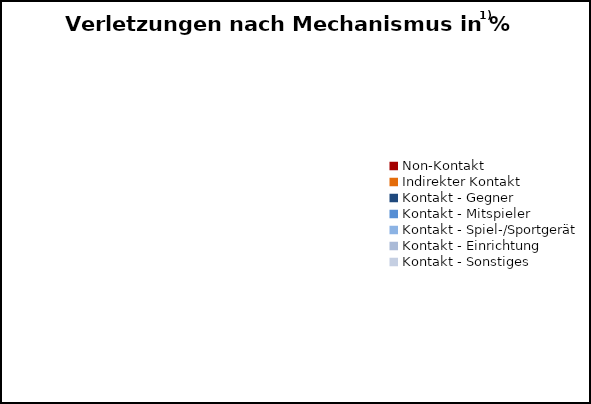
| Category | Series 0 |
|---|---|
| Non-Kontakt | 0 |
| Indirekter Kontakt | 0 |
| Kontakt - Gegner | 0 |
| Kontakt - Mitspieler | 0 |
| Kontakt - Spiel-/Sportgerät | 0 |
| Kontakt - Einrichtung | 0 |
| Kontakt - Sonstiges | 0 |